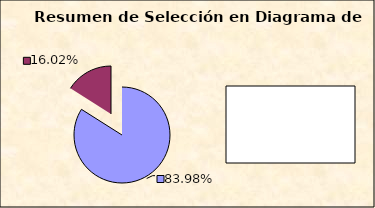
| Category | Compras de AF 2006 |
|---|---|
| Items más Significativos | 0.84 |
|  Partidas no Probadas | 0.16 |